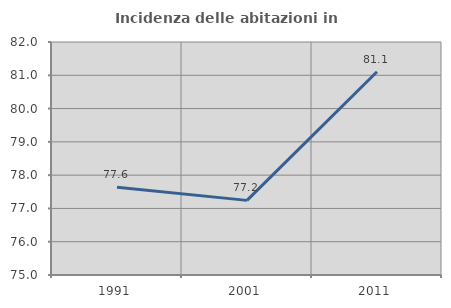
| Category | Incidenza delle abitazioni in proprietà  |
|---|---|
| 1991.0 | 77.638 |
| 2001.0 | 77.242 |
| 2011.0 | 81.108 |